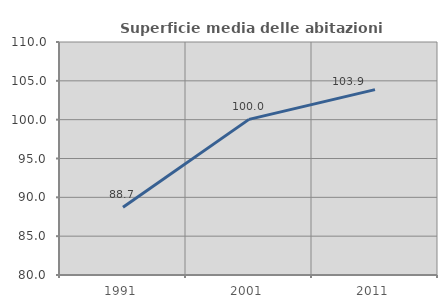
| Category | Superficie media delle abitazioni occupate |
|---|---|
| 1991.0 | 88.731 |
| 2001.0 | 100.037 |
| 2011.0 | 103.863 |